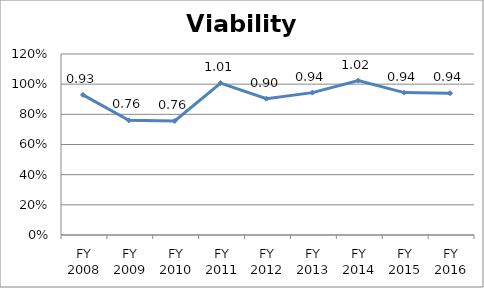
| Category | Viability ratio |
|---|---|
| FY 2016 | 0.94 |
| FY 2015 | 0.944 |
| FY 2014 | 1.024 |
| FY 2013 | 0.944 |
| FY 2012 | 0.904 |
| FY 2011 | 1.007 |
| FY 2010 | 0.756 |
| FY 2009 | 0.76 |
| FY 2008 | 0.929 |